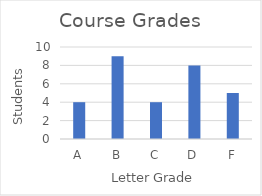
| Category | Series 0 |
|---|---|
| A | 4 |
| B | 9 |
| C | 4 |
| D | 8 |
| F | 5 |